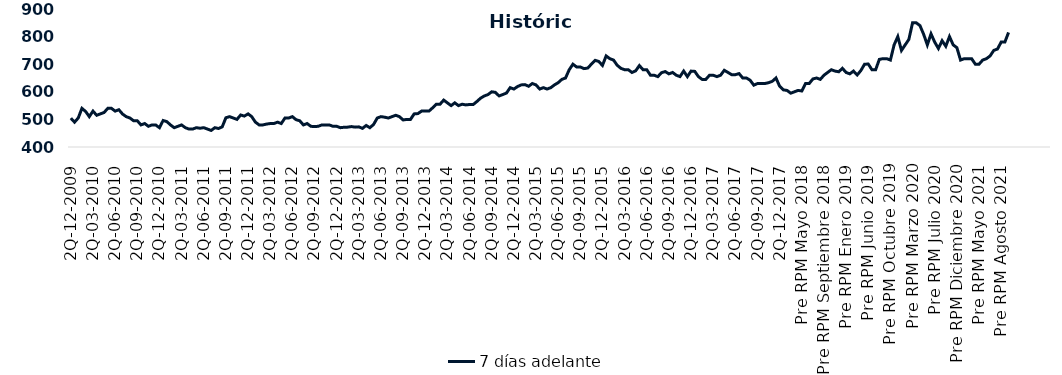
| Category | 7 días adelante  |
|---|---|
| 2Q-12-2009 | 504.5 |
| 1Q-01-2010 | 490 |
| 2Q-01-2010 | 505 |
| 1Q-02-2010 | 540 |
| 2Q-02-2010 | 528.8 |
| 1Q-03-2010 | 510 |
| 2Q-03-2010 | 530 |
| 1Q-04-2010 | 515 |
| 2Q-04-2010 | 520 |
| 1Q-05-2010 | 525 |
| 2Q-05-2010 | 540 |
| 1Q-06-2010 | 540 |
| 2Q-06-2010 | 530 |
| 1Q-07-2010 | 535 |
| 2Q-07-2010 | 519.5 |
| 1Q-08-2010 | 510 |
| 2Q-08-2010 | 505 |
| 1Q-09-2010 | 495 |
| 2Q-09-2010 | 495 |
| 1Q-10-2010 | 480 |
| 2Q-10-2010 | 485 |
| 1Q-11-2010 | 475 |
| 2Q-11-2010 | 480 |
| 1Q-12-2010 | 479.65 |
| 2Q-12-2010 | 470 |
| 1Q-01-2011 | 496 |
| 2Q-01-2011 | 492 |
| 1Q-02-2011 | 479.75 |
| 2Q-02-2011 | 470 |
| 1Q-03-2011 | 475 |
| 2Q-03-2011 | 480 |
| 1Q-04-2011 | 470 |
| 2Q-04-2011 | 465 |
| 1Q-05-2011 | 465 |
| 2Q-05-2011 | 470 |
| 1Q-06-2011 | 468 |
| 2Q-06-2011 | 470 |
| 1Q-07-2011 | 465 |
| 2Q-07-2011 | 460 |
| 1Q-08-2011 | 470 |
| 2Q-08-2011 | 467 |
| 1Q-09-2011 | 473 |
| 2Q-09-2011 | 506 |
| 1Q-10-2011 | 510 |
| 2Q-10-2011 | 505 |
| 1Q-11-2011 | 500 |
| 2Q-11-2011 | 516 |
| 1Q-12-2011 | 512 |
| 2Q-12-2011 | 520 |
| 1Q-01-2012 | 510 |
| 2Q-01-2012 | 490 |
| 1Q-02-2012 | 480 |
| 2Q-02-2012 | 480 |
| 1Q-03-2012 | 483 |
| 2Q-03-2012 | 485 |
| 1Q-04-2012 | 485 |
| 2Q-04-2012 | 490 |
| 1Q-05-2012 | 485 |
| 2Q-05-2012 | 505 |
| 1Q-06-2012 | 505 |
| 2Q-06-2012 | 510 |
| 1Q-07-2012 | 499 |
| 2Q-07-2012 | 495 |
| 1Q-08-2012 | 480 |
| 2Q-08-2012 | 485 |
| 1Q-09-2012 | 475 |
| 2Q-09-2012 | 474 |
| 1Q-10-2012 | 475 |
| 2Q-10-2012 | 480 |
| 1Q-11-2012 | 480 |
| 2Q-11-2012 | 480 |
| 1Q-12-2012 | 475 |
| 2Q-12-2012 | 475 |
| 1Q-01-2013 | 470 |
| 2Q-01-2013 | 471.5 |
| 1Q-02-2013 | 472 |
| 2Q-02-2013 | 474 |
| 1Q-03-2013 | 472 |
| 2Q-03-2013 | 473 |
| 1Q-04-2013 | 467.5 |
| 2Q-04-2013 | 478 |
| 1Q-05-2013 | 470 |
| 2Q-05-2013 | 481.5 |
| 1Q-06-2013 | 505 |
| 2Q-06-2013 | 510 |
| 1Q-07-2013 | 508 |
| 2Q-07-2013 | 505 |
| 1Q-08-2013 | 510 |
| 2Q-08-2013 | 515 |
| 1Q-09-2013 | 510 |
| 2Q-09-2013 | 498 |
| 1Q-10-2013 | 500 |
| 2Q-10-2013 | 500 |
| 1Q-11-2013 | 520 |
| 2Q-11-2013 | 521 |
| 1Q-12-2013 | 530 |
| 2Q-12-2013 | 530 |
| 1Q-01-2014 | 530 |
| 2Q-01-2014 | 542 |
| 1Q-02-2014 | 555 |
| 2Q-02-2014 | 555 |
| 1Q-03-2014 | 570 |
| 2Q-03-2014 | 560 |
| 1Q-04-2014 | 550 |
| 2Q-04-2014 | 560 |
| 1Q-05-2014 | 550 |
| 2Q-05-2014 | 555 |
| 1Q-06-2014 | 552.5 |
| 2Q-06-2014 | 554 |
| 1Q-07-2014 | 554 |
| 2Q-07-2014 | 565 |
| 1Q-08-2014 | 577 |
| 2Q-08-2014 | 585 |
| 1Q-09-2014 | 590 |
| 2Q-09-2014 | 600 |
| 1Q-10-2014 | 598 |
| 2Q-10-2014 | 585 |
| 1Q-11-2014 | 590 |
| 2Q-11-2014 | 595.5 |
| 1Q-12-2014 | 615 |
| 2Q-12-2014 | 610 |
| 1Q-01-2015 | 619 |
| 2Q-01-2015 | 625 |
| 1Q-02-2015 | 626 |
| 2Q-02-2015 | 620 |
| 1Q-03-2015 | 630 |
| 2Q-03-2015 | 625 |
| 1Q-04-2015 | 610 |
| 2Q-04-2015 | 615 |
| 1Q-05-2015 | 610 |
| 2Q-05-2015 | 615 |
| 1Q-06-2015 | 625 |
| 2Q-06-2015 | 633 |
| 1Q-07-2015 | 645 |
| 2Q-07-2015 | 650 |
| 1Q-08-2015 | 680 |
| 2Q-08-2015 | 700 |
| 1Q-09-2015 | 690 |
| 2Q-09-2015 | 690 |
| 1Q-10-2015 | 684 |
| 2Q-10-2015 | 686 |
| 1Q-11-2015 | 700 |
| 2Q-11-2015 | 714 |
| 1Q-12-2015 | 710 |
| 2Q-12-2015 | 695.5 |
| 1Q-01-2016 | 730 |
| 2Q-01-2016 | 720 |
| 1Q-02-2016 | 715 |
| 2Q-02-2016 | 696 |
| 1Q-03-2016 | 685 |
| 2Q-03-2016 | 680 |
| 1Q-04-2016 | 680 |
| 2Q-04-2016 | 670 |
| 1Q-05-2016 | 676 |
| 2Q-05-2016 | 695 |
| 1Q-06-2016 | 680 |
| 2Q-06-2016 | 680 |
| 1Q-07-2016 | 660 |
| 2Q-07-2016 | 660 |
| 1Q-08-2016 | 655 |
| 2Q-08-2016 | 669.25 |
| 1Q-09-2016 | 673.3 |
| 2Q-09-2016 | 665 |
| 1Q-10-2016 | 670 |
| 2Q-10-2016 | 660 |
| 1Q-11-2016 | 655 |
| 2Q-11-2016 | 675 |
| 1Q-12-2016 | 655 |
| 2Q-12-2016 | 675 |
| 1Q-01-2017 | 674 |
| 2Q-01-2017 | 655 |
| 1Q-02-2017 | 645 |
| 2Q-02-2017 | 645 |
| 1Q-03-2017 | 660 |
| 2Q-03-2017 | 660 |
| 1Q-04-2017 | 655 |
| 2Q-04-2017 | 660 |
| 1Q-05-2017 | 678 |
| 2Q-05-2017 | 670 |
| 1Q-06-2017 | 662 |
| 2Q-06-2017 | 662 |
| 1Q-07-2017 | 666 |
| 2Q-07-2017 | 650 |
| 1Q-08-2017 | 650 |
| 2Q-08-2017 | 642 |
| 1Q-09-2017 | 624 |
| 2Q-09-2017 | 630 |
| 1Q-10-2017 | 630 |
| 2Q-10-2017 | 630 |
| 1Q-11-2017 | 633 |
| 2Q-11-2017 | 638 |
| 1Q-12-2017 | 650 |
| 2Q-12-2017 | 620 |
| 1Q-01-2018 | 607 |
| 2Q-01-2018 | 605 |
| Post RPM Febrero 2018 | 595 |
| Pre RPM Marzo 2018 | 600 |
| Post RPM Marzo 2018 | 605 |
| Pre RPM Mayo 2018 | 603 |
| Post RPM Mayo 2018 | 630 |
| Pre RPM Junio 2018 | 630 |
| Post RPM Junio 2018 | 646.5 |
| Pre RPM Julio 2018 | 650 |
| Post RPM Julio 2018 | 645 |
| Pre RPM Septiembre 2018 | 660 |
| Post RPM Septiembre 2018 | 670 |
| Pre RPM Octubre 2018 | 680 |
| Post RPM Octubre 2018 | 675 |
| Pre RPM Diciembre 2018 | 672.5 |
| Post RPM Diciembre 2018 | 685 |
| Pre RPM Enero 2019 | 670 |
| Post RPM Enero 2019 | 665 |
| Pre RPM Marzo 2019 | 675 |
| Post RPM Marzo 2019 | 661 |
| Pre RPM Mayo 2019 | 677 |
| Post RPM Mayo 2019 | 700 |
| Pre RPM Junio 2019 | 700.5 |
| Post RPM Junio 2019 | 680 |
| Pre RPM Julio 2019 | 680 |
| Post RPM Julio 2019 | 717.5 |
| Pre RPM Septiembre 2019 | 720 |
| Post RPM Septiembre 2019 | 720 |
| Pre RPM Octubre 2019 | 715 |
| Post RPM Octubre 2019 | 770 |
| Pre RPM Diciembre 2019 | 800 |
| Post RPM Diciembre 2019 | 750 |
| Pre RPM Enero 2020 | 770 |
| Post RPM Enero 2020 | 790 |
| Pre RPM Marzo 2020 | 850 |
| Post RPM Marzo 2020 | 850 |
| Pre RPM Mayo 2020 | 840 |
| Post RPM Mayo 2020 | 808.5 |
| Pre RPM Junio 2020 | 770 |
| Post RPM Junio 2020 | 810 |
| Pre RPM Julio 2020 | 780 |
| Post RPM Julio 2020 | 757 |
| Pre RPM Septiembre 2020 | 785 |
| Post RPM Septiembre 2020 | 765 |
| Pre RPM Octubre 2020 | 800 |
| Post RPM Octubre 2020 | 770 |
| Pre RPM Diciembre 2020 | 760 |
| Post RPM Diciembre 2020 | 715 |
| Pre RPM Enero 2021 | 720 |
| Post RPM Enero 2021 | 720 |
| Pre RPM Marzo 2021 | 720 |
| Post RPM Marzo 2021 | 700 |
| Pre RPM Mayo 2021 | 700 |
| Post RPM Mayo 2021 | 715 |
| Pre RPM Junio 2021 | 720 |
| Post RPM Junio 2021 | 730 |
| Pre RPM Julio 2021 | 750 |
| Post RPM Julio 2021 | 755 |
| Pre RPM Agosto 2021 | 780 |
| Post RPM Agosto 2021 | 780 |
| Pre RPM Octubre 2021 | 815 |